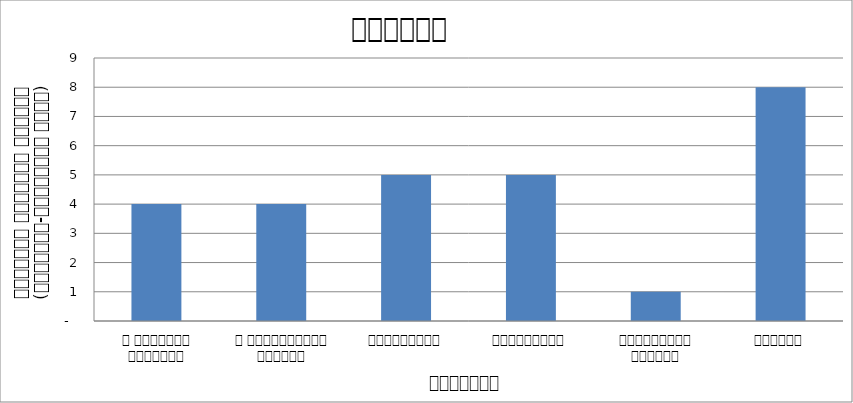
| Category | शिक्षा |
|---|---|
| द हिमालयन टाइम्स् | 4 |
| द काठमाण्डौं पोस्ट् | 4 |
| रिपब्लिका | 5 |
| कान्तिपुर | 5 |
| अन्नपूर्ण पोस्ट् | 1 |
| नागरिक | 8 |